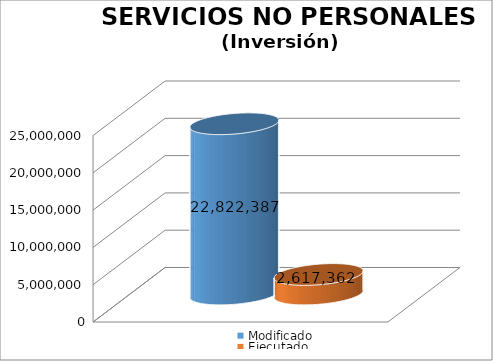
| Category | Modificado | Ejecutado |
|---|---|---|
| 0 | 22822387 | 2617362.19 |